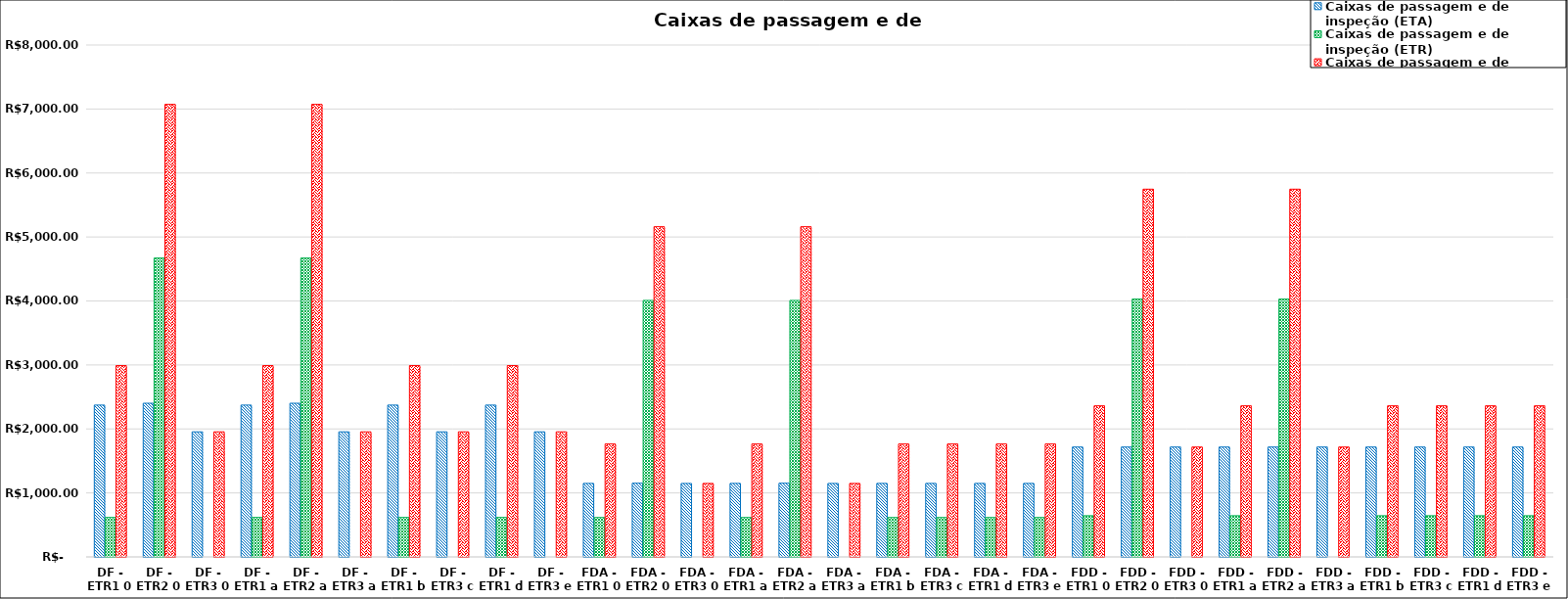
| Category | Caixas de passagem e de inspeção (ETA) | Caixas de passagem e de inspeção (ETR) | Caixas de passagem e de inspeção (total) |
|---|---|---|---|
| DF - ETR1 0 | 2372.821 | 616.887 | 2989.708 |
| DF - ETR2 0 | 2401.439 | 4671.022 | 7072.461 |
| DF - ETR3 0 | 1954.775 | 0 | 1954.775 |
| DF - ETR1 a | 2372.821 | 616.887 | 2989.708 |
| DF - ETR2 a | 2401.439 | 4671.022 | 7072.461 |
| DF - ETR3 a | 1954.775 | 0 | 1954.775 |
| DF - ETR1 b | 2372.821 | 616.887 | 2989.708 |
| DF - ETR3 c | 1954.775 | 0 | 1954.775 |
| DF - ETR1 d | 2372.821 | 616.887 | 2989.708 |
| DF - ETR3 e | 1954.775 | 0 | 1954.775 |
| FDA - ETR1 0 | 1148.752 | 616.053 | 1764.805 |
| FDA - ETR2 0 | 1151.51 | 4008.88 | 5160.39 |
| FDA - ETR3 0 | 1147.947 | 0 | 1147.947 |
| FDA - ETR1 a | 1148.752 | 616.053 | 1764.805 |
| FDA - ETR2 a | 1151.51 | 4008.88 | 5160.39 |
| FDA - ETR3 a | 1147.947 | 0 | 1147.947 |
| FDA - ETR1 b | 1148.752 | 616.053 | 1764.805 |
| FDA - ETR3 c | 1148.752 | 616.053 | 1764.805 |
| FDA - ETR1 d | 1148.752 | 616.053 | 1764.805 |
| FDA - ETR3 e | 1148.752 | 616.053 | 1764.805 |
| FDD - ETR1 0 | 1717.161 | 644.019 | 2361.179 |
| FDD - ETR2 0 | 1717.161 | 4029.949 | 5747.109 |
| FDD - ETR3 0 | 1717.161 | 0 | 1717.161 |
| FDD - ETR1 a | 1717.161 | 644.019 | 2361.179 |
| FDD - ETR2 a | 1717.161 | 4029.949 | 5747.109 |
| FDD - ETR3 a | 1717.161 | 0 | 1717.161 |
| FDD - ETR1 b | 1717.161 | 644.019 | 2361.179 |
| FDD - ETR3 c | 1717.161 | 644.019 | 2361.179 |
| FDD - ETR1 d | 1717.161 | 644.019 | 2361.179 |
| FDD - ETR3 e | 1717.161 | 644.019 | 2361.179 |